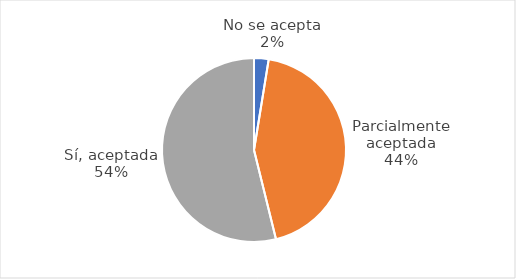
| Category | Cuenta de ID |
|---|---|
| No se acepta | 1 |
| Parcialmente aceptada | 17 |
| Sí, aceptada | 21 |